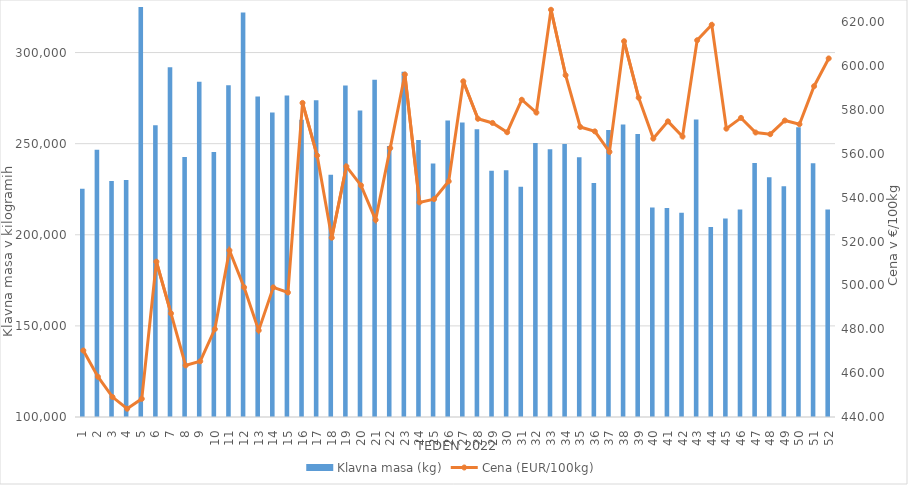
| Category | Klavna masa (kg) |
|---|---|
| 1.0 | 225300 |
| 2.0 | 246712 |
| 3.0 | 229541 |
| 4.0 | 230074 |
| 5.0 | 328640 |
| 6.0 | 260108 |
| 7.0 | 291887 |
| 8.0 | 242732 |
| 9.0 | 283987 |
| 10.0 | 245414 |
| 11.0 | 282092 |
| 12.0 | 321936 |
| 13.0 | 275950 |
| 14.0 | 267148 |
| 15.0 | 276417 |
| 16.0 | 263098 |
| 17.0 | 273824 |
| 18.0 | 232926 |
| 19.0 | 281859 |
| 20.0 | 268153 |
| 21.0 | 285073 |
| 22.0 | 248783 |
| 23.0 | 289478 |
| 24.0 | 252069 |
| 25.0 | 239099 |
| 26.0 | 262689 |
| 27.0 | 261656 |
| 28.0 | 257905 |
| 29.0 | 235185 |
| 30.0 | 235475 |
| 31.0 | 226322 |
| 32.0 | 250418 |
| 33.0 | 246996 |
| 34.0 | 249873 |
| 35.0 | 242516 |
| 36.0 | 228469 |
| 37.0 | 257511 |
| 38.0 | 260481 |
| 39.0 | 255370 |
| 40.0 | 214936 |
| 41.0 | 214672 |
| 42.0 | 212066 |
| 43.0 | 263287 |
| 44.0 | 204280 |
| 45.0 | 208920 |
| 46.0 | 213836 |
| 47.0 | 239417 |
| 48.0 | 231565 |
| 49.0 | 226575 |
| 50.0 | 259073 |
| 51.0 | 239211 |
| 52.0 | 213841 |